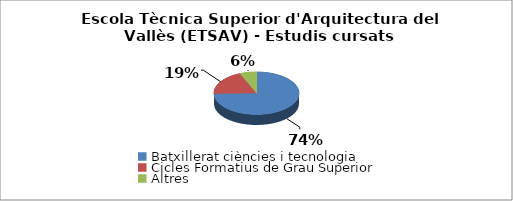
| Category | Escola Tècnica Superior d'Arquitectura del Vallès (ETSAV) - Estudis cursats |
|---|---|
| Batxillerat ciències i tecnologia | 0.745 |
| Cicles Formatius de Grau Superior | 0.191 |
| Altres | 0.064 |